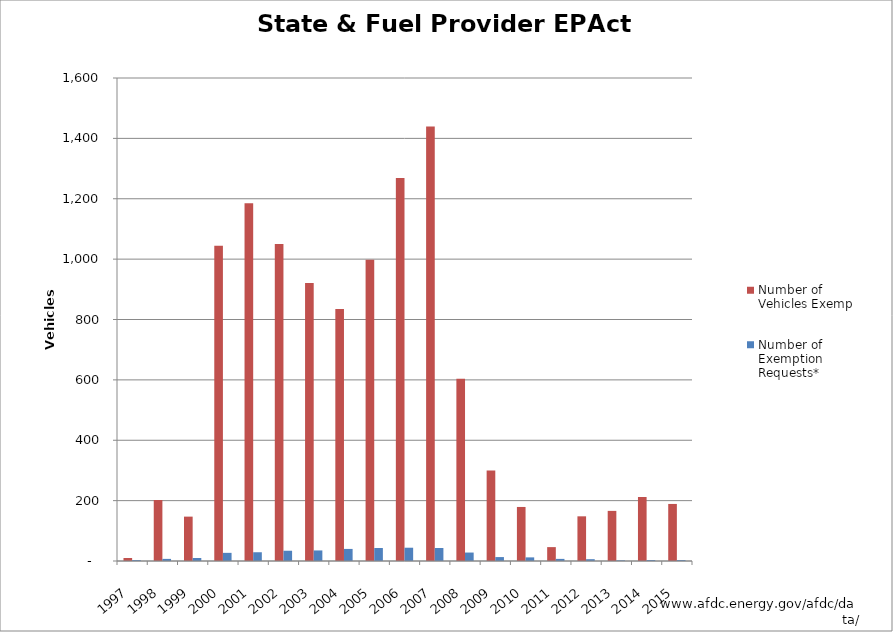
| Category | Number of Vehicles Exempted | Number of Exemption Requests* |
|---|---|---|
| 1997.0 | 10 | 3 |
| 1998.0 | 202 | 7 |
| 1999.0 | 147 | 10 |
| 2000.0 | 1044 | 27 |
| 2001.0 | 1185 | 29 |
| 2002.0 | 1050 | 34 |
| 2003.0 | 921 | 35 |
| 2004.0 | 835 | 40 |
| 2005.0 | 998 | 43 |
| 2006.0 | 1269 | 44 |
| 2007.0 | 1439 | 43 |
| 2008.0 | 604 | 28 |
| 2009.0 | 300 | 13 |
| 2010.0 | 179 | 12 |
| 2011.0 | 46 | 7 |
| 2012.0 | 148 | 6 |
| 2013.0 | 166 | 2 |
| 2014.0 | 212 | 3 |
| 2015.0 | 189 | 3 |